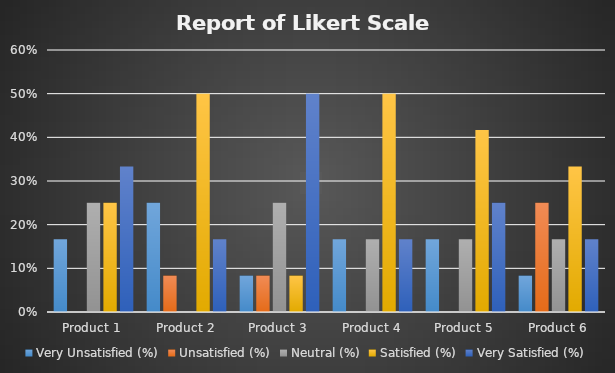
| Category | Very Unsatisfied (%) | Unsatisfied (%) | Neutral (%) | Satisfied (%) | Very Satisfied (%) |
|---|---|---|---|---|---|
| Product 1 | 0.167 | 0 | 0.25 | 0.25 | 0.333 |
| Product 2 | 0.25 | 0.083 | 0 | 0.5 | 0.167 |
| Product 3 | 0.083 | 0.083 | 0.25 | 0.083 | 0.5 |
| Product 4 | 0.167 | 0 | 0.167 | 0.5 | 0.167 |
| Product 5 | 0.167 | 0 | 0.167 | 0.417 | 0.25 |
| Product 6 | 0.083 | 0.25 | 0.167 | 0.333 | 0.167 |